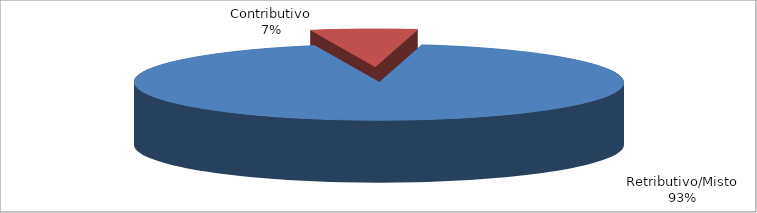
| Category | Series 1 |
|---|---|
| Retributivo/Misto | 58299 |
| Contributivo | 4401 |